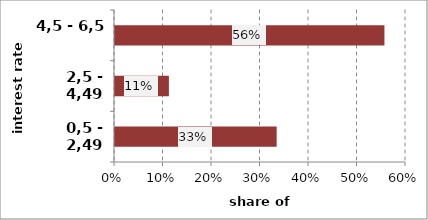
| Category | Series 0 |
|---|---|
| 0,5 - 2,49 | 0.333 |
| 2,5 - 4,49 | 0.111 |
| 4,5 - 6,5 | 0.556 |